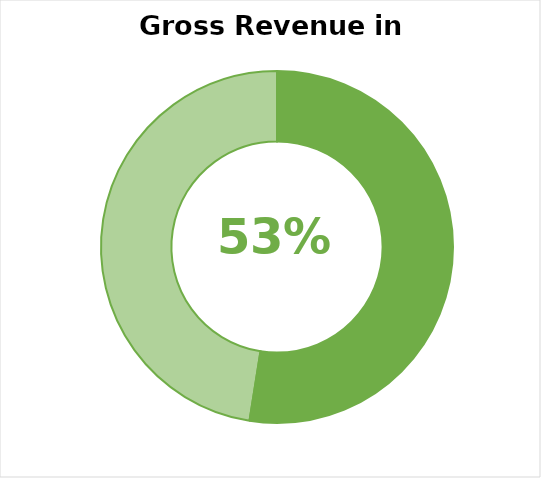
| Category | Series 0 |
|---|---|
| 0 | 0.525 |
| 1 | 0.475 |